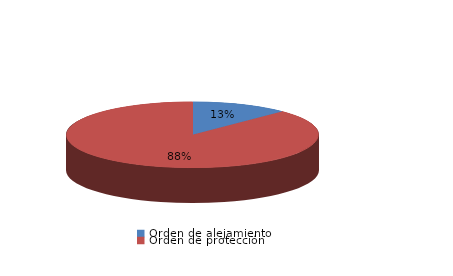
| Category | Series 0 |
|---|---|
| Orden de alejamiento | 4 |
| Orden de protección | 28 |